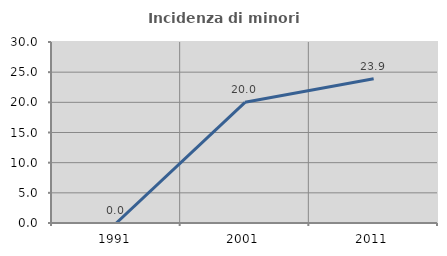
| Category | Incidenza di minori stranieri |
|---|---|
| 1991.0 | 0 |
| 2001.0 | 20 |
| 2011.0 | 23.913 |